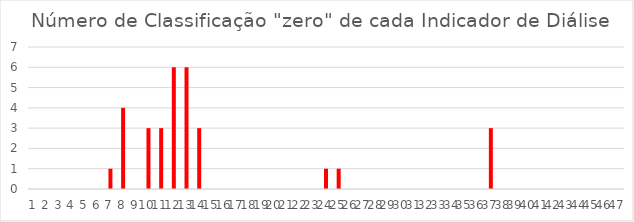
| Category | Series 0 |
|---|---|
| 0 | 0 |
| 1 | 0 |
| 2 | 0 |
| 3 | 0 |
| 4 | 0 |
| 5 | 0 |
| 6 | 1 |
| 7 | 4 |
| 8 | 0 |
| 9 | 3 |
| 10 | 3 |
| 11 | 6 |
| 12 | 6 |
| 13 | 3 |
| 14 | 0 |
| 15 | 0 |
| 16 | 0 |
| 17 | 0 |
| 18 | 0 |
| 19 | 0 |
| 20 | 0 |
| 21 | 0 |
| 22 | 0 |
| 23 | 1 |
| 24 | 1 |
| 25 | 0 |
| 26 | 0 |
| 27 | 0 |
| 28 | 0 |
| 29 | 0 |
| 30 | 0 |
| 31 | 0 |
| 32 | 0 |
| 33 | 0 |
| 34 | 0 |
| 35 | 0 |
| 36 | 3 |
| 37 | 0 |
| 38 | 0 |
| 39 | 0 |
| 40 | 0 |
| 41 | 0 |
| 42 | 0 |
| 43 | 0 |
| 44 | 0 |
| 45 | 0 |
| 46 | 0 |